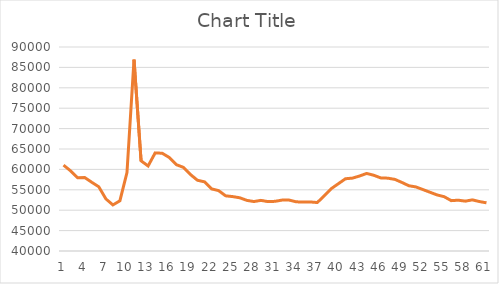
| Category | Series 0 |
|---|---|
| 0 | 61066.63 |
| 1 | 59644.606 |
| 2 | 57937.006 |
| 3 | 58003.756 |
| 4 | 56840.017 |
| 5 | 55751.177 |
| 6 | 52779.308 |
| 7 | 51294.481 |
| 8 | 52334.146 |
| 9 | 59209.978 |
| 10 | 86917.675 |
| 11 | 62106.913 |
| 12 | 60836.974 |
| 13 | 64043.847 |
| 14 | 63959.27 |
| 15 | 62916.098 |
| 16 | 61162.307 |
| 17 | 60505.857 |
| 18 | 58753.01 |
| 19 | 57339.642 |
| 20 | 56950.632 |
| 21 | 55225.712 |
| 22 | 54798.03 |
| 23 | 53520.789 |
| 24 | 53332.14 |
| 25 | 53048.994 |
| 26 | 52412.21 |
| 27 | 52123.789 |
| 28 | 52408.636 |
| 29 | 52105.946 |
| 30 | 52172.701 |
| 31 | 52476.382 |
| 32 | 52480.777 |
| 33 | 52056.25 |
| 34 | 51991.93 |
| 35 | 52022.779 |
| 36 | 51876.302 |
| 37 | 53565.231 |
| 38 | 55298.963 |
| 39 | 56507.278 |
| 40 | 57708.358 |
| 41 | 57865.521 |
| 42 | 58382.69 |
| 43 | 59010.039 |
| 44 | 58570.829 |
| 45 | 57916.72 |
| 46 | 57850.808 |
| 47 | 57558.243 |
| 48 | 56803.736 |
| 49 | 55985.766 |
| 50 | 55697.056 |
| 51 | 55046.866 |
| 52 | 54390.467 |
| 53 | 53739.451 |
| 54 | 53309.437 |
| 55 | 52343.474 |
| 56 | 52452.25 |
| 57 | 52218.386 |
| 58 | 52532.6 |
| 59 | 52119.038 |
| 60 | 51807.308 |